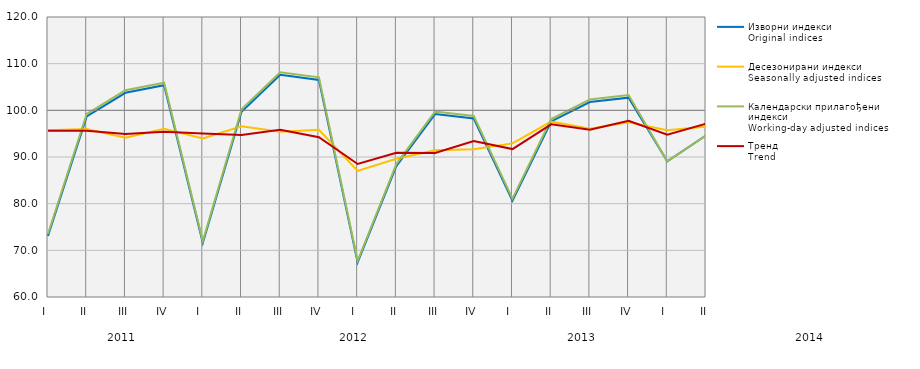
| Category | Изворни индекси
Original indices | Десезонирани индекси
Seasonally adjusted indices | Календарски прилагођени индекси
Working-day adjusted indices | Тренд
Trend |
|---|---|---|---|---|
| I  | 73.105 | 95.736 | 73.486 | 95.62 |
| II | 98.686 | 95.984 | 99.209 | 95.612 |
| III | 103.754 | 94.152 | 104.311 | 94.942 |
| IV | 105.376 | 96.05 | 105.918 | 95.415 |
| I  | 71.601 | 93.986 | 71.98 | 95.044 |
| II | 99.705 | 96.564 | 100.233 | 94.695 |
| III | 107.6 | 95.437 | 108.153 | 95.85 |
| IV | 106.508 | 95.841 | 107.078 | 94.228 |
| I  | 67.411 | 87.029 | 67.763 | 88.511 |
| II | 88.026 | 89.609 | 88.493 | 90.889 |
| III | 99.2 | 91.457 | 99.732 | 90.865 |
| IV | 98.255 | 91.66 | 98.782 | 93.435 |
| I  | 80.624 | 92.921 | 81.046 | 91.697 |
| II | 97.612 | 97.575 | 98.129 | 97.01 |
| III | 101.777 | 96.033 | 102.323 | 95.819 |
| IV | 102.721 | 97.446 | 103.272 | 97.763 |
| I  | 89.092 | 95.744 | 89.087 | 94.768 |
| II | 94.609 | 96.518 | 94.609 | 97.139 |